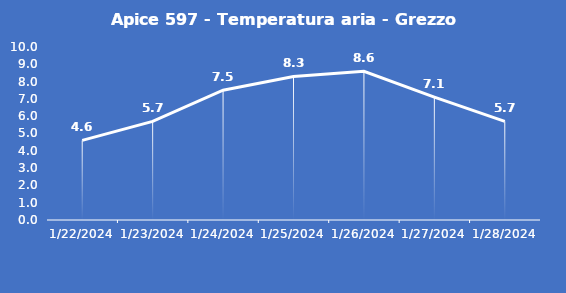
| Category | Apice 597 - Temperatura aria - Grezzo (°C) |
|---|---|
| 1/22/24 | 4.6 |
| 1/23/24 | 5.7 |
| 1/24/24 | 7.5 |
| 1/25/24 | 8.3 |
| 1/26/24 | 8.6 |
| 1/27/24 | 7.1 |
| 1/28/24 | 5.7 |